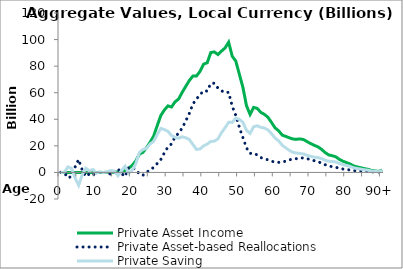
| Category | Private Asset Income | Private Asset-based Reallocations | Private Saving |
|---|---|---|---|
| 0 | 0 | 109.439 | -109.439 |
|  | 0 | -169.85 | 169.85 |
| 2 | 0 | -4127.463 | 4127.463 |
| 3 | 0 | -3039.89 | 3039.89 |
| 4 | 0 | 4038.723 | -4038.723 |
| 5 | 0 | 9721.396 | -9721.396 |
| 6 | 0 | 1845.506 | -1845.506 |
| 7 | 0 | -3115.571 | 3115.571 |
| 8 | 0 | -1192.392 | 1192.392 |
| 9 | 0 | -2239.276 | 2239.276 |
| 10 | 0 | 650.29 | -650.29 |
| 11 | 0.655 | -503.585 | 504.239 |
| 12 | 17.237 | 151.822 | -134.585 |
| 13 | 53.288 | -431.441 | 484.729 |
| 14 | 116.774 | -1311.899 | 1428.672 |
| 15 | 161.906 | -866.686 | 1028.591 |
| 16 | 300.786 | 2773.659 | -2472.873 |
| 17 | 603.192 | -760.599 | 1363.791 |
| 18 | 1528.413 | -3113.184 | 4641.597 |
| 19 | 3136.06 | 3617.094 | -481.034 |
| 20 | 5342.871 | 3647.077 | 1695.794 |
| 21 | 8653.46 | 2121.323 | 6532.137 |
| 22 | 13755.256 | -1228.236 | 14983.491 |
| 23 | 15124.261 | -2120.586 | 17244.848 |
| 24 | 18561.231 | 457.792 | 18103.44 |
| 25 | 22718.996 | 1333.475 | 21385.521 |
| 26 | 27320.823 | 3961.214 | 23359.609 |
| 27 | 35201.919 | 6681.305 | 28520.614 |
| 28 | 42809.415 | 9670.496 | 33138.92 |
| 29 | 46996.949 | 14767.208 | 32229.741 |
| 30 | 50089.014 | 19144.462 | 30944.553 |
| 31 | 49252.226 | 21481.657 | 27770.568 |
| 32 | 53159.24 | 26784.676 | 26374.564 |
| 33 | 55292.761 | 29567.318 | 25725.443 |
| 34 | 60323.098 | 33447.042 | 26876.056 |
| 35 | 64818.406 | 38761.879 | 26056.528 |
| 36 | 69206.513 | 44450.591 | 24755.922 |
| 37 | 72560.501 | 51545.678 | 21014.823 |
| 38 | 72553.739 | 55286.629 | 17267.109 |
| 39 | 76164.962 | 58477.94 | 17687.022 |
| 40 | 81521.256 | 61497.499 | 20023.757 |
| 41 | 82550.439 | 61197.826 | 21352.614 |
| 42 | 90236.232 | 66929.862 | 23306.371 |
| 43 | 90702.968 | 67179.81 | 23523.157 |
| 44 | 88752.813 | 63467.853 | 25284.96 |
| 45 | 91353.482 | 61467.299 | 29886.184 |
| 46 | 93692.453 | 60017.786 | 33674.667 |
| 47 | 98026.152 | 60309.53 | 37716.622 |
| 48 | 87500.263 | 49839.138 | 37661.125 |
| 49 | 83802.6 | 42982.026 | 40820.574 |
| 50 | 73887.445 | 33948.125 | 39939.32 |
| 51 | 63979.067 | 26239.996 | 37739.071 |
| 52 | 50203.955 | 18514.834 | 31689.121 |
| 53 | 43666.515 | 14302.259 | 29364.256 |
| 54 | 48918.657 | 14523.699 | 34394.958 |
| 55 | 48221.661 | 13122.778 | 35098.883 |
| 56 | 45186.113 | 11220.771 | 33965.342 |
| 57 | 43724.822 | 10277.972 | 33446.85 |
| 58 | 41517.672 | 9481.094 | 32036.578 |
| 59 | 37624.96 | 8460.503 | 29164.456 |
| 60 | 33542.288 | 7666.026 | 25876.262 |
| 61 | 31344.974 | 7587.959 | 23757.015 |
| 62 | 28095.98 | 7625.503 | 20470.477 |
| 63 | 27099.92 | 8599.192 | 18500.727 |
| 64 | 26072.087 | 9505.26 | 16566.827 |
| 65 | 25122.318 | 9971.056 | 15151.261 |
| 66 | 24952.947 | 10381.216 | 14571.732 |
| 67 | 25233.139 | 10957.457 | 14275.682 |
| 68 | 24711.783 | 10832.244 | 13879.54 |
| 69 | 23144.655 | 10315.465 | 12829.189 |
| 70 | 21664.916 | 9566.828 | 12098.089 |
| 71 | 20360.374 | 8812.344 | 11548.03 |
| 72 | 19278.869 | 8090.217 | 11188.653 |
| 73 | 17411.559 | 7009.101 | 10402.457 |
| 74 | 14997.889 | 5818.11 | 9179.78 |
| 75 | 13188.568 | 4788.624 | 8399.944 |
| 76 | 12594.321 | 4360.749 | 8233.572 |
| 77 | 11765.163 | 3869.802 | 7895.36 |
| 78 | 9834.65 | 3113.837 | 6720.813 |
| 79 | 8434.398 | 2547.369 | 5887.028 |
| 80 | 7387.304 | 2158.701 | 5228.603 |
| 81 | 6365.078 | 1828.704 | 4536.375 |
| 82 | 4888.292 | 1394.219 | 3494.073 |
| 83 | 4119.186 | 1166.827 | 2952.36 |
| 84 | 3537.477 | 1046.795 | 2490.681 |
| 85 | 2814.119 | 829.425 | 1984.694 |
| 86 | 2377.618 | 691.039 | 1686.579 |
| 87 | 1495.873 | 429.289 | 1066.584 |
| 88 | 1070.966 | 317.832 | 753.134 |
| 89 | 738.919 | 214.74 | 524.178 |
| 90+ | 1719.149 | 491.889 | 1227.26 |